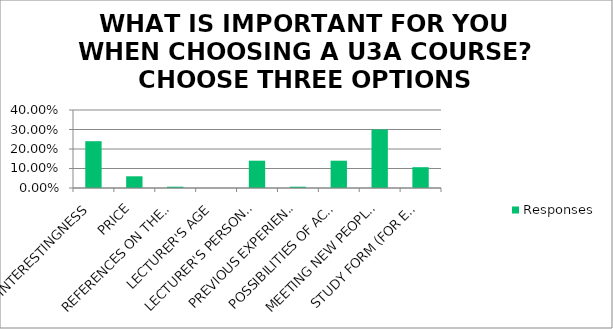
| Category | Responses |
|---|---|
| INTERESTINGNESS | 0.24 |
| PRICE | 0.06 |
| REFERENCES ON THE LECTURER | 0.007 |
| LECTURER'S AGE | 0 |
| LECTURER'S PERSONALITY | 0.14 |
| PREVIOUS EXPERIENCE | 0.007 |
| POSSIBILITIES OF ACTIVE ENGAGEMENT IN U3A | 0.14 |
| MEETING NEW PEOPLE, NEW SOCIAL CONTACTS | 0.3 |
| STUDY FORM (FOR EXAMPLE LECTURES, STUDIES OVER THE INTERNET, EXCURSIONS) | 0.107 |